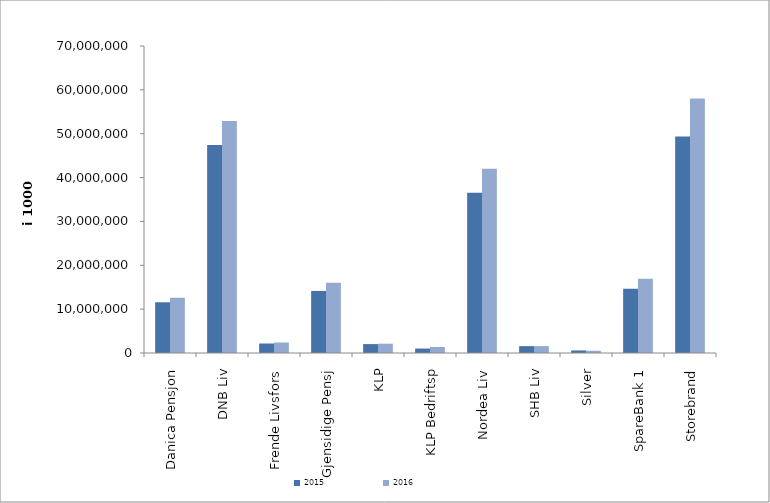
| Category | 2015 | 2016 |
|---|---|---|
| 0 | 11569001.886 | 12599531.245 |
| 1 | 47449700 | 52892825 |
| 2 | 2163790 | 2394875 |
| 3 | 14148914.607 | 16013492.852 |
| 4 | 2029624.791 | 2120218.962 |
| 5 | 1015795 | 1361843 |
| 6 | 36516794.106 | 42006581.1 |
| 7 | 1562174 | 1571024 |
| 8 | 584555.291 | 515694.203 |
| 9 | 14634426.34 | 16928884.255 |
| 10 | 49369943.155 | 58026529.603 |